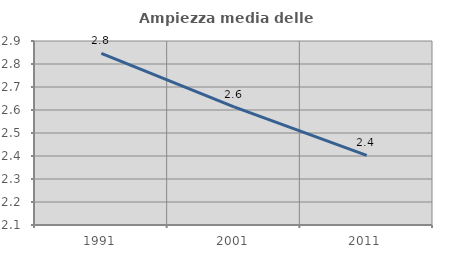
| Category | Ampiezza media delle famiglie |
|---|---|
| 1991.0 | 2.847 |
| 2001.0 | 2.614 |
| 2011.0 | 2.403 |